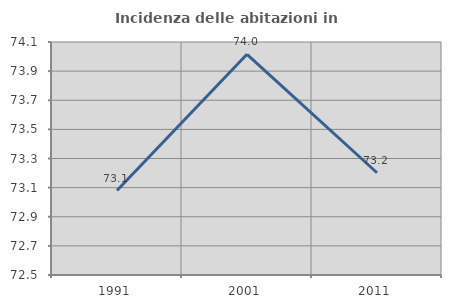
| Category | Incidenza delle abitazioni in proprietà  |
|---|---|
| 1991.0 | 73.08 |
| 2001.0 | 74.016 |
| 2011.0 | 73.202 |